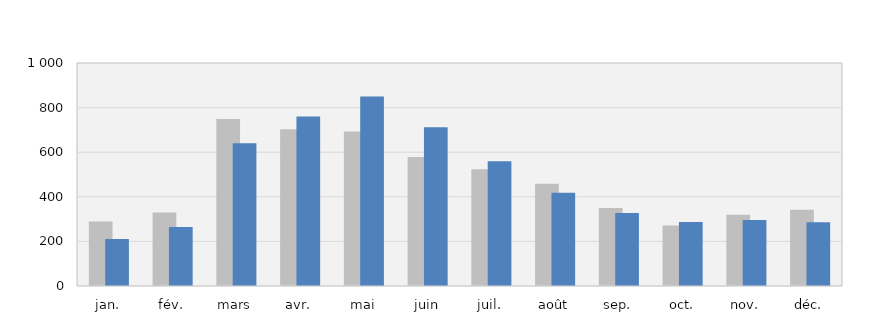
| Category | 2017 | 2018 |
|---|---|---|
| jan. | 289 | 211 |
| fév. | 330 | 265 |
| mars | 749 | 640 |
| avr. | 703 | 760 |
| mai | 693 | 850 |
| juin | 579 | 712 |
| juil. | 523 | 559 |
| août | 458 | 418 |
| sep. | 350 | 327 |
| oct. | 271 | 287 |
| nov. | 320 | 296 |
| déc. | 342 | 286 |